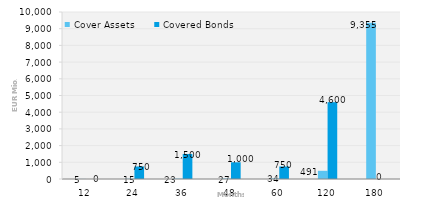
| Category | Cover Assets | Covered Bonds |
|---|---|---|
| 12.0 | 5.04 | 0 |
| 24.0 | 14.564 | 750 |
| 36.0 | 23.088 | 1500 |
| 48.0 | 26.952 | 1000 |
| 60.0 | 34.483 | 750 |
| 120.0 | 490.771 | 4600 |
| 180.0 | 9355.196 | 0 |